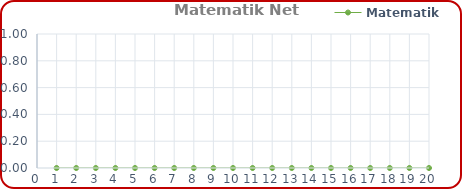
| Category | Matematik |
|---|---|
| 0 | 0 |
| 1 | 0 |
| 2 | 0 |
| 3 | 0 |
| 4 | 0 |
| 5 | 0 |
| 6 | 0 |
| 7 | 0 |
| 8 | 0 |
| 9 | 0 |
| 10 | 0 |
| 11 | 0 |
| 12 | 0 |
| 13 | 0 |
| 14 | 0 |
| 15 | 0 |
| 16 | 0 |
| 17 | 0 |
| 18 | 0 |
| 19 | 0 |